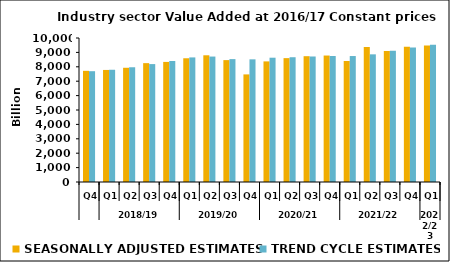
| Category | SEASONALLY ADJUSTED ESTIMATES | TREND CYCLE ESTIMATES |
|---|---|---|
| 0 | 7719.78 | 7694.517 |
| 1 | 7781.425 | 7794.175 |
| 2 | 7932.402 | 7968.464 |
| 3 | 8254.189 | 8188.295 |
| 4 | 8339.045 | 8402.871 |
| 5 | 8592.786 | 8651.988 |
| 6 | 8799.639 | 8711.605 |
| 7 | 8464.413 | 8534.194 |
| 8 | 7472.068 | 8518.378 |
| 9 | 8375.442 | 8631.627 |
| 10 | 8602.069 | 8664.94 |
| 11 | 8736.671 | 8716.013 |
| 12 | 8782.481 | 8748.97 |
| 13 | 8404.521 | 8747.806 |
| 14 | 9373.086 | 8865.227 |
| 15 | 9091.847 | 9123.179 |
| 16 | 9395.894 | 9344.169 |
| 17 | 9482.465 | 9522.605 |